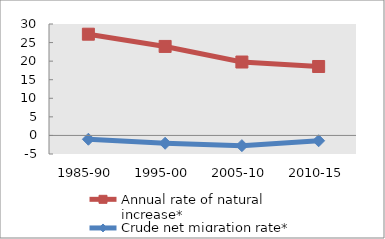
| Category | Annual rate of natural increase* | Crude net migration rate* |
|---|---|---|
| 1985-90 | 27.255 | -1.028 |
| 1995-00 | 23.962 | -2.108 |
| 2005-10 | 19.762 | -2.752 |
| 2010-15 | 18.558 | -1.434 |